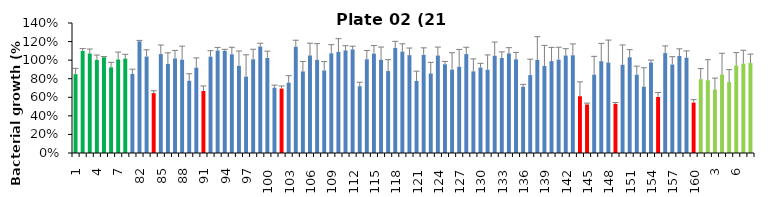
| Category | 21 h % |
|---|---|
| 1.0 | 0.849 |
| 2.0 | 1.099 |
| 3.0 | 1.071 |
| 4.0 | 1.003 |
| 5.0 | 1.031 |
| 6.0 | 0.923 |
| 7.0 | 1.007 |
| 8.0 | 1.017 |
| 81.0 | 0.852 |
| 82.0 | 1.202 |
| 83.0 | 1.039 |
| 84.0 | 0.645 |
| 85.0 | 1.065 |
| 86.0 | 0.959 |
| 87.0 | 1.019 |
| 88.0 | 1.005 |
| 89.0 | 0.778 |
| 90.0 | 0.919 |
| 91.0 | 0.668 |
| 92.0 | 1.038 |
| 93.0 | 1.103 |
| 94.0 | 1.101 |
| 95.0 | 1.063 |
| 96.0 | 0.939 |
| 97.0 | 0.823 |
| 98.0 | 1.009 |
| 99.0 | 1.147 |
| 100.0 | 1.023 |
| 101.0 | 0.703 |
| 102.0 | 0.694 |
| 103.0 | 0.757 |
| 104.0 | 1.144 |
| 105.0 | 0.879 |
| 106.0 | 1.05 |
| 107.0 | 1.003 |
| 108.0 | 0.888 |
| 109.0 | 1.073 |
| 110.0 | 1.088 |
| 111.0 | 1.105 |
| 112.0 | 1.116 |
| 113.0 | 0.719 |
| 114.0 | 1.009 |
| 115.0 | 1.07 |
| 116.0 | 1.005 |
| 117.0 | 0.883 |
| 118.0 | 1.132 |
| 119.0 | 1.092 |
| 120.0 | 1.054 |
| 121.0 | 0.776 |
| 122.0 | 1.057 |
| 123.0 | 0.857 |
| 124.0 | 1.05 |
| 125.0 | 0.956 |
| 126.0 | 0.898 |
| 127.0 | 0.929 |
| 128.0 | 1.065 |
| 129.0 | 0.879 |
| 130.0 | 0.92 |
| 131.0 | 0.897 |
| 132.0 | 1.048 |
| 133.0 | 1.023 |
| 134.0 | 1.073 |
| 135.0 | 1.009 |
| 136.0 | 0.714 |
| 137.0 | 0.839 |
| 138.0 | 1.003 |
| 139.0 | 0.938 |
| 140.0 | 0.99 |
| 141.0 | 1.005 |
| 142.0 | 1.05 |
| 143.0 | 1.052 |
| 144.0 | 0.611 |
| 145.0 | 0.523 |
| 146.0 | 0.844 |
| 147.0 | 0.989 |
| 148.0 | 0.974 |
| 149.0 | 0.529 |
| 150.0 | 0.95 |
| 151.0 | 1.031 |
| 152.0 | 0.843 |
| 153.0 | 0.714 |
| 154.0 | 0.975 |
| 155.0 | 0.603 |
| 156.0 | 1.076 |
| 157.0 | 0.953 |
| 158.0 | 1.045 |
| 159.0 | 1.026 |
| 160.0 | 0.543 |
| 1.0 | 0.795 |
| 2.0 | 0.784 |
| 3.0 | 0.684 |
| 4.0 | 0.845 |
| 5.0 | 0.764 |
| 6.0 | 0.943 |
| 7.0 | 0.962 |
| 8.0 | 0.969 |